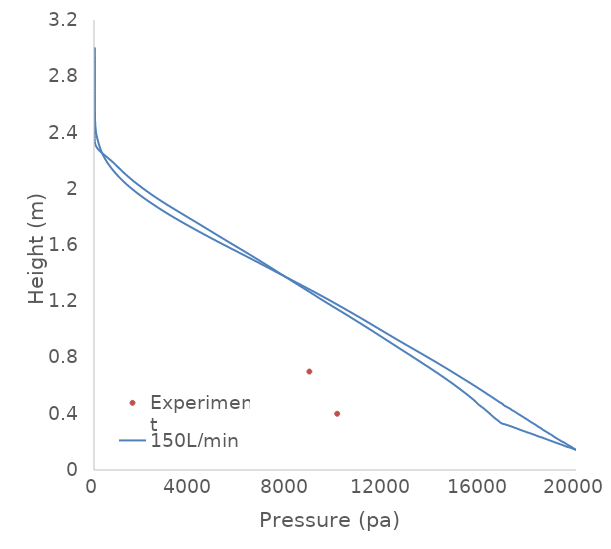
| Category | Experiment |
|---|---|
| 10091.0 | 0.4 |
| 8937.0 | 0.7 |